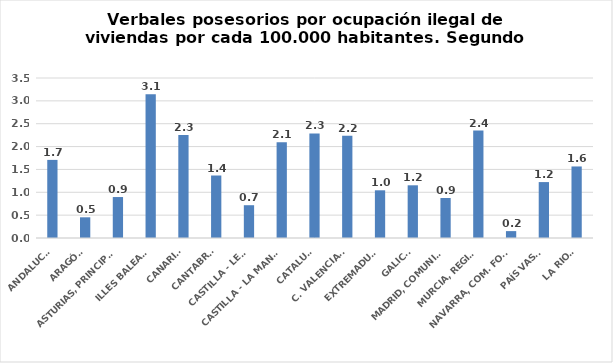
| Category | Series 0 |
|---|---|
| ANDALUCÍA | 1.709 |
| ARAGÓN | 0.453 |
| ASTURIAS, PRINCIPADO | 0.896 |
| ILLES BALEARS | 3.146 |
| CANARIAS | 2.251 |
| CANTABRIA | 1.367 |
| CASTILLA - LEÓN | 0.717 |
| CASTILLA - LA MANCHA | 2.095 |
| CATALUÑA | 2.287 |
| C. VALENCIANA | 2.239 |
| EXTREMADURA | 1.043 |
| GALICIA | 1.153 |
| MADRID, COMUNIDAD | 0.875 |
| MURCIA, REGIÓN | 2.351 |
| NAVARRA, COM. FORAL | 0.151 |
| PAÍS VASCO | 1.223 |
| LA RIOJA | 1.565 |